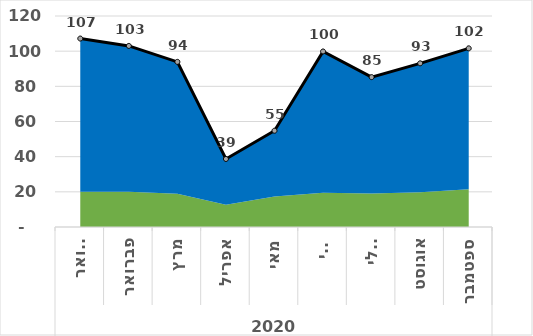
| Category | סה"כ |
|---|---|
| 0 | 107.178 |
| 1 | 102.987 |
| 2 | 93.92 |
| 3 | 38.698 |
| 4 | 54.756 |
| 5 | 99.834 |
| 6 | 85.237 |
| 7 | 93.086 |
| 8 | 101.61 |